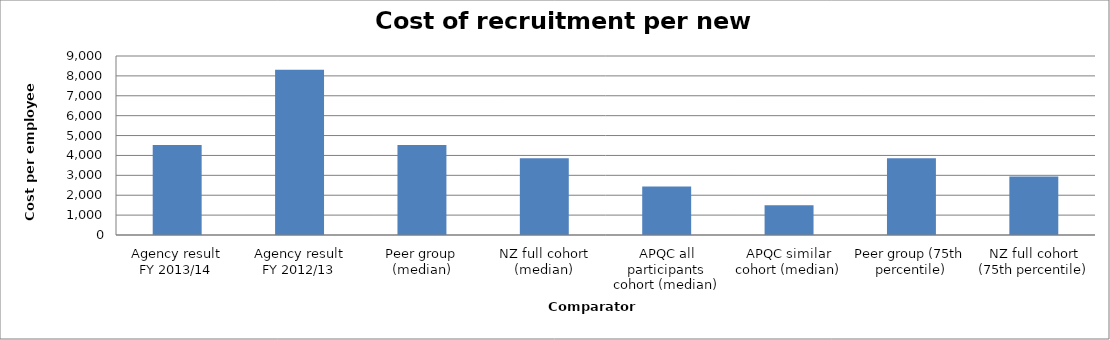
| Category | Result |
|---|---|
| Agency result
FY 2013/14 | 4521.127 |
| Agency result
FY 2012/13 | 8306.306 |
| Peer group (median) | 4521.127 |
| NZ full cohort (median) | 3855.62 |
| APQC all participants cohort (median) | 2434.05 |
| APQC similar cohort (median) | 1500 |
| Peer group (75th percentile) | 3855.62 |
| NZ full cohort (75th percentile) | 2941.091 |